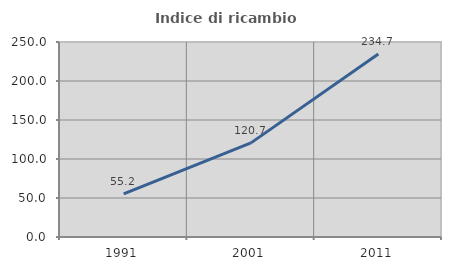
| Category | Indice di ricambio occupazionale  |
|---|---|
| 1991.0 | 55.172 |
| 2001.0 | 120.652 |
| 2011.0 | 234.737 |